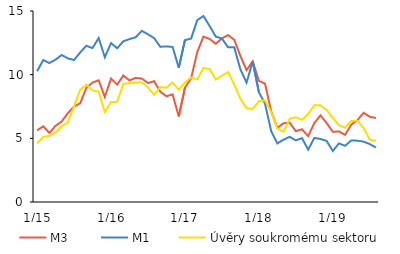
| Category | M3  | M1 | Úvěry soukromému sektoru |
|---|---|---|---|
|  1/15 | 5.622 | 10.265 | 4.593 |
| 2 | 5.948 | 11.151 | 5.114 |
| 3 | 5.423 | 10.914 | 5.186 |
| 4 | 5.983 | 11.181 | 5.467 |
| 5 | 6.33 | 11.545 | 5.955 |
| 6 | 6.98 | 11.278 | 6.253 |
| 7 | 7.5 | 11.149 | 7.503 |
| 8 | 7.755 | 11.745 | 8.802 |
| 9 | 8.971 | 12.27 | 9.227 |
| 10 | 9.377 | 12.089 | 8.753 |
| 11 | 9.559 | 12.878 | 8.672 |
| 12 | 8.244 | 11.367 | 7.06 |
|  1/16 | 9.691 | 12.477 | 7.853 |
| 2 | 9.221 | 12.071 | 7.865 |
| 3 | 9.937 | 12.619 | 9.286 |
| 4 | 9.548 | 12.796 | 9.325 |
| 5 | 9.747 | 12.937 | 9.385 |
| 6 | 9.696 | 13.442 | 9.403 |
| 7 | 9.341 | 13.169 | 8.992 |
| 8 | 9.484 | 12.872 | 8.426 |
| 9 | 8.659 | 12.193 | 9.022 |
| 10 | 8.307 | 12.218 | 8.975 |
| 11 | 8.449 | 12.177 | 9.38 |
| 12 | 6.723 | 10.54 | 8.816 |
|  1/17 | 8.966 | 12.711 | 9.379 |
| 2 | 9.714 | 12.834 | 9.781 |
| 3 | 11.775 | 14.282 | 9.62 |
| 4 | 12.987 | 14.606 | 10.528 |
| 5 | 12.808 | 13.83 | 10.445 |
| 6 | 12.425 | 12.993 | 9.619 |
| 7 | 12.849 | 12.842 | 9.914 |
| 8 | 13.105 | 12.147 | 10.193 |
| 9 | 12.743 | 12.148 | 9.238 |
| 10 | 11.473 | 10.419 | 8.113 |
| 11 | 10.355 | 9.377 | 7.368 |
| 12 | 11.047 | 11.032 | 7.305 |
|  1/18 | 9.516 | 8.626 | 7.918 |
| 2 | 9.298 | 7.714 | 7.983 |
| 3 | 7.121 | 5.573 | 7.051 |
| 4 | 5.819 | 4.602 | 5.78 |
| 5 | 6.185 | 4.894 | 5.522 |
| 6 | 6.228 | 5.118 | 6.536 |
| 7 | 5.561 | 4.84 | 6.657 |
| 8 | 5.712 | 5.02 | 6.454 |
| 9 | 5.172 | 4.113 | 6.908 |
| 10 | 6.2 | 5.031 | 7.59 |
| 11 | 6.807 | 4.95 | 7.588 |
| 12 | 6.195 | 4.794 | 7.229 |
|  1/19 | 5.516 | 4.009 | 6.6 |
| 2 | 5.54 | 4.604 | 6.035 |
| 3 | 5.275 | 4.413 | 5.835 |
| 4 | 6.075 | 4.839 | 6.369 |
| 5 | 6.427 | 4.813 | 6.374 |
| 6 | 7.002 | 4.742 | 5.815 |
| 7 | 6.692 | 4.549 | 4.899 |
| 8 | 6.593 | 4.28 | 4.81 |